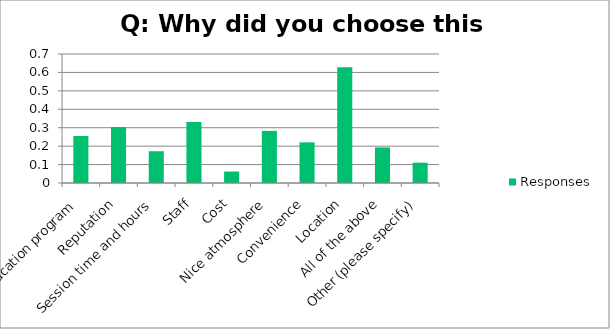
| Category | Responses |
|---|---|
| Education program | 0.255 |
| Reputation | 0.303 |
| Session time and hours | 0.172 |
| Staff | 0.331 |
| Cost | 0.062 |
| Nice atmosphere | 0.283 |
| Convenience | 0.221 |
| Location | 0.628 |
| All of the above | 0.193 |
| Other (please specify) | 0.11 |